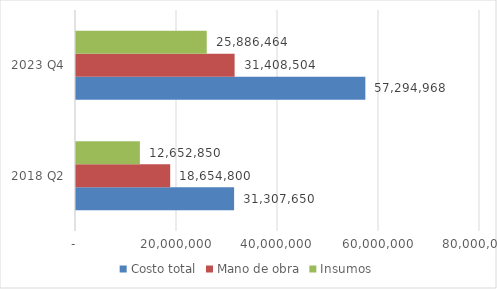
| Category | Costo total | Mano de obra | Insumos |
|---|---|---|---|
| 2018 Q2 | 31307650 | 18654800 | 12652850 |
| 2023 Q4 | 57294968.085 | 31408504 | 25886464.085 |